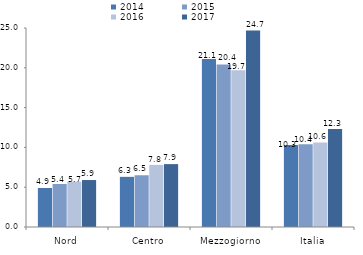
| Category | 2014 | 2015 | 2016 | 2017 |
|---|---|---|---|---|
| Nord | 4.9 | 5.4 | 5.7 | 5.9 |
| Centro | 6.3 | 6.5 | 7.8 | 7.9 |
| Mezzogiorno | 21.1 | 20.4 | 19.7 | 24.7 |
| Italia | 10.3 | 10.4 | 10.6 | 12.3 |